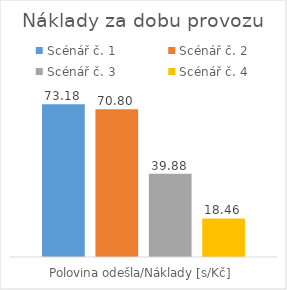
| Category | Scénář č. 1 | Scénář č. 2 | Scénář č. 3 | Scénář č. 4 |
|---|---|---|---|---|
| Polovina odešla/Náklady [s/Kč] | 73.176 | 70.797 | 39.878 | 18.457 |